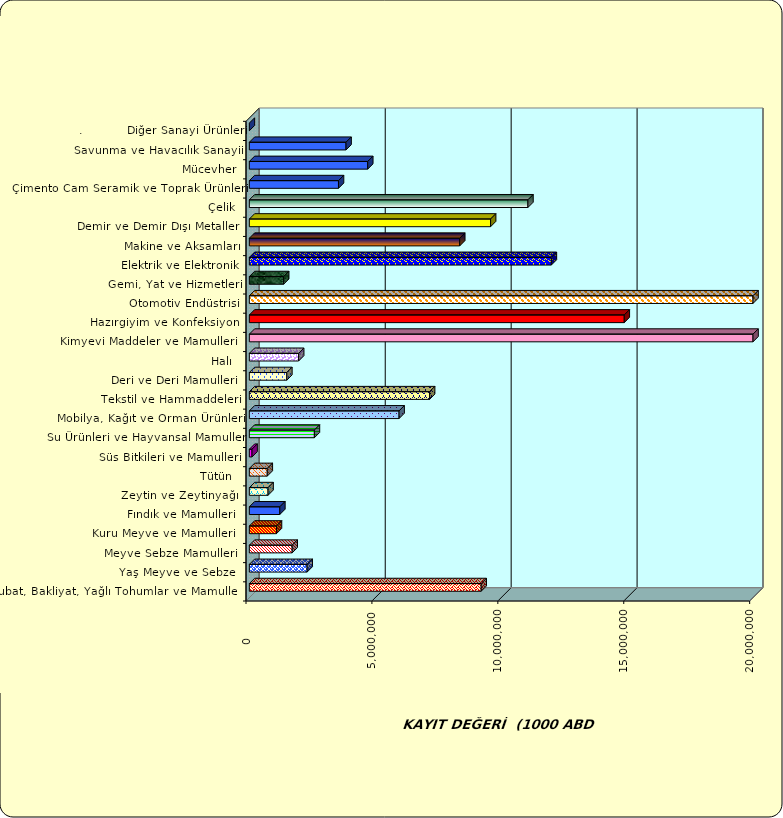
| Category | Series 0 |
|---|---|
|  Hububat, Bakliyat, Yağlı Tohumlar ve Mamulleri  | 9205575.799 |
|  Yaş Meyve ve Sebze   | 2295351.918 |
|  Meyve Sebze Mamulleri  | 1700954.466 |
|  Kuru Meyve ve Mamulleri   | 1076465.923 |
|  Fındık ve Mamulleri  | 1209910.132 |
|  Zeytin ve Zeytinyağı  | 742599.277 |
|  Tütün  | 711399.173 |
|  Süs Bitkileri ve Mamulleri | 106348.325 |
|  Su Ürünleri ve Hayvansal Mamuller | 2582544.356 |
|  Mobilya, Kağıt ve Orman Ürünleri | 5945035.585 |
|  Tekstil ve Hammaddeleri | 7156799.184 |
|  Deri ve Deri Mamulleri  | 1487816.49 |
|  Halı  | 1957155.705 |
|  Kimyevi Maddeler ve Mamulleri   | 22309301.625 |
|  Hazırgiyim ve Konfeksiyon  | 14887598.714 |
|  Otomotiv Endüstrisi | 25619838.277 |
|  Gemi, Yat ve Hizmetleri | 1361539.09 |
|  Elektrik ve Elektronik | 11992032.222 |
|  Makine ve Aksamları | 8353851.063 |
|  Demir ve Demir Dışı Metaller  | 9579539.124 |
|  Çelik | 11061659.613 |
|  Çimento Cam Seramik ve Toprak Ürünleri | 3539800.583 |
|  Mücevher | 4700809.169 |
|  Savunma ve Havacılık Sanayii | 3839670.448 |
| .           Diğer Sanayi Ürünleri | 0 |